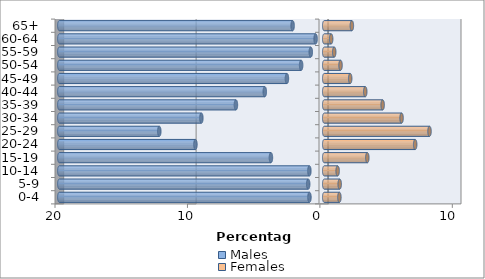
| Category | Males | Females |
|---|---|---|
| 0-4 | -1.116 | 1.146 |
| 5-9 | -1.21 | 1.168 |
| 10-14 | -1.121 | 1.013 |
| 15-19 | -4.024 | 3.255 |
| 20-24 | -9.725 | 6.868 |
| 25-29 | -12.453 | 7.95 |
| 30-34 | -9.276 | 5.84 |
| 35-39 | -6.667 | 4.411 |
| 40-44 | -4.488 | 3.099 |
| 45-49 | -2.815 | 1.961 |
| 50-54 | -1.743 | 1.232 |
| 55-59 | -1.015 | 0.755 |
| 60-64 | -0.65 | 0.524 |
| 65+ | -2.387 | 2.087 |